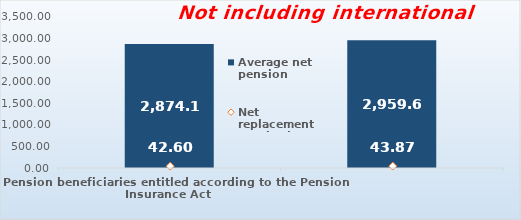
| Category | Average net pension  |
|---|---|
| Pension beneficiaries entitled according to the Pension Insurance Act   | 2874.11 |
| Pension beneficiaries entitled to pension FOR THE FIRST TIME in 2020 according to the Pension Insurance Act  - NEW BENEFICIARIES | 2959.67 |